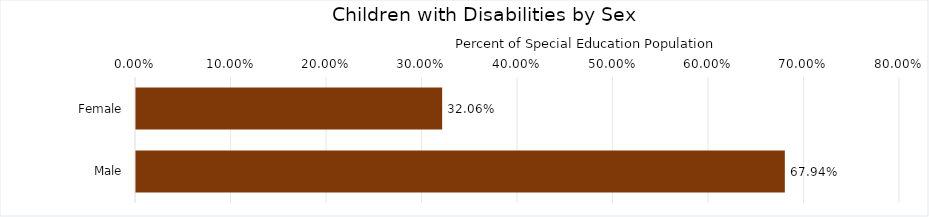
| Category | Percentage |
|---|---|
| Female | 0.321 |
| Male | 0.679 |